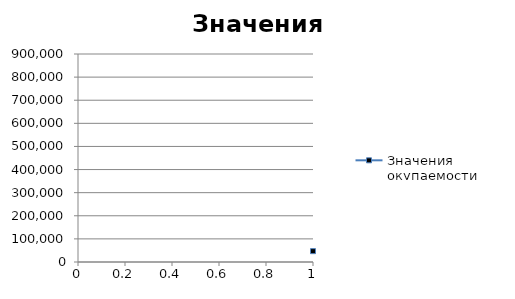
| Category | Значения окупаемости |
|---|---|
| 0 | 46986.651 |
| 1 | 172276.619 |
| 2 | 375869.905 |
| 3 | 579463.191 |
| 4 | 704753.16 |
| 5 | 830043.128 |